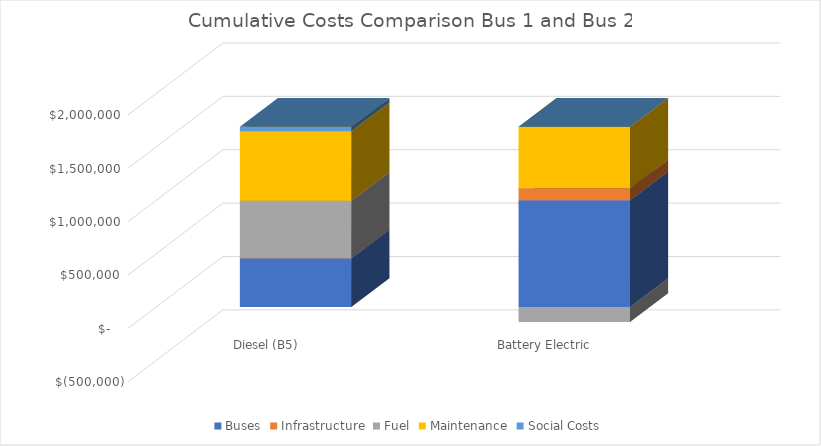
| Category | Buses | Infrastructure | Fuel | Maintenance | Social Costs |
|---|---|---|---|---|---|
| Diesel (B5) | 456250 | 0 | 538167.318 | 651594.668 | 41901.269 |
| Battery Electric | 1000000 | 111250 | -141224.307 | 575443.68 | 1900.659 |